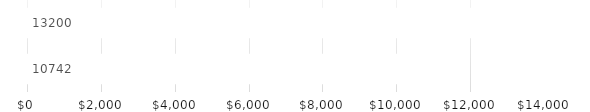
| Category | ANNUAL TOTALS |
|---|---|
| 0 | 10742 |
| 1 | 13200 |